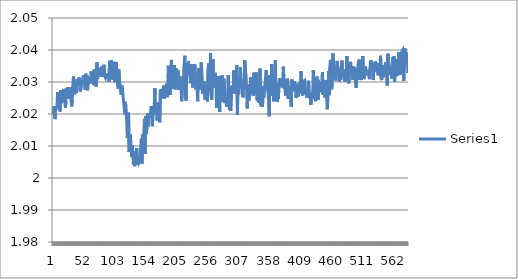
| Category | Series 0 |
|---|---|
| 0 | 2.02 |
| 1 | 2.022 |
| 2 | 2.019 |
| 3 | 2.018 |
| 4 | 2.022 |
| 5 | 2.022 |
| 6 | 2.022 |
| 7 | 2.027 |
| 8 | 2.022 |
| 9 | 2.026 |
| 10 | 2.023 |
| 11 | 2.021 |
| 12 | 2.027 |
| 13 | 2.023 |
| 14 | 2.026 |
| 15 | 2.025 |
| 16 | 2.027 |
| 17 | 2.028 |
| 18 | 2.025 |
| 19 | 2.023 |
| 20 | 2.022 |
| 21 | 2.028 |
| 22 | 2.025 |
| 23 | 2.025 |
| 24 | 2.028 |
| 25 | 2.026 |
| 26 | 2.025 |
| 27 | 2.026 |
| 28 | 2.028 |
| 29 | 2.028 |
| 30 | 2.022 |
| 31 | 2.024 |
| 32 | 2.029 |
| 33 | 2.032 |
| 34 | 2.031 |
| 35 | 2.026 |
| 36 | 2.029 |
| 37 | 2.029 |
| 38 | 2.027 |
| 39 | 2.031 |
| 40 | 2.029 |
| 41 | 2.03 |
| 42 | 2.031 |
| 43 | 2.03 |
| 44 | 2.027 |
| 45 | 2.027 |
| 46 | 2.029 |
| 47 | 2.03 |
| 48 | 2.031 |
| 49 | 2.032 |
| 50 | 2.032 |
| 51 | 2.031 |
| 52 | 2.028 |
| 53 | 2.033 |
| 54 | 2.03 |
| 55 | 2.032 |
| 56 | 2.027 |
| 57 | 2.03 |
| 58 | 2.029 |
| 59 | 2.031 |
| 60 | 2.03 |
| 61 | 2.03 |
| 62 | 2.033 |
| 63 | 2.03 |
| 64 | 2.033 |
| 65 | 2.033 |
| 66 | 2.029 |
| 67 | 2.034 |
| 68 | 2.029 |
| 69 | 2.033 |
| 70 | 2.029 |
| 71 | 2.036 |
| 72 | 2.035 |
| 73 | 2.033 |
| 74 | 2.032 |
| 75 | 2.032 |
| 76 | 2.033 |
| 77 | 2.034 |
| 78 | 2.032 |
| 79 | 2.032 |
| 80 | 2.035 |
| 81 | 2.032 |
| 82 | 2.033 |
| 83 | 2.035 |
| 84 | 2.032 |
| 85 | 2.031 |
| 86 | 2.033 |
| 87 | 2.033 |
| 88 | 2.031 |
| 89 | 2.033 |
| 90 | 2.031 |
| 91 | 2.03 |
| 92 | 2.037 |
| 93 | 2.035 |
| 94 | 2.035 |
| 95 | 2.037 |
| 96 | 2.031 |
| 97 | 2.031 |
| 98 | 2.032 |
| 99 | 2.034 |
| 100 | 2.036 |
| 101 | 2.03 |
| 102 | 2.034 |
| 103 | 2.036 |
| 104 | 2.033 |
| 105 | 2.03 |
| 106 | 2.028 |
| 107 | 2.034 |
| 108 | 2.031 |
| 109 | 2.031 |
| 110 | 2.027 |
| 111 | 2.026 |
| 112 | 2.029 |
| 113 | 2.028 |
| 114 | 2.026 |
| 115 | 2.024 |
| 116 | 2.023 |
| 117 | 2.02 |
| 118 | 2.024 |
| 119 | 2.02 |
| 120 | 2.018 |
| 121 | 2.013 |
| 122 | 2.012 |
| 123 | 2.02 |
| 124 | 2.008 |
| 125 | 2.01 |
| 126 | 2.014 |
| 127 | 2.01 |
| 128 | 2.007 |
| 129 | 2.01 |
| 130 | 2.007 |
| 131 | 2.004 |
| 132 | 2.008 |
| 133 | 2.004 |
| 134 | 2.006 |
| 135 | 2.006 |
| 136 | 2.009 |
| 137 | 2.004 |
| 138 | 2.007 |
| 139 | 2.006 |
| 140 | 2.005 |
| 141 | 2.005 |
| 142 | 2.009 |
| 143 | 2.008 |
| 144 | 2.012 |
| 145 | 2.005 |
| 146 | 2.014 |
| 147 | 2.012 |
| 148 | 2.014 |
| 149 | 2.018 |
| 150 | 2.007 |
| 151 | 2.019 |
| 152 | 2.014 |
| 153 | 2.016 |
| 154 | 2.02 |
| 155 | 2.016 |
| 156 | 2.017 |
| 157 | 2.02 |
| 158 | 2.019 |
| 159 | 2.02 |
| 160 | 2.022 |
| 161 | 2.022 |
| 162 | 2.016 |
| 163 | 2.02 |
| 164 | 2.021 |
| 165 | 2.022 |
| 166 | 2.028 |
| 167 | 2.02 |
| 168 | 2.023 |
| 169 | 2.023 |
| 170 | 2.018 |
| 171 | 2.024 |
| 172 | 2.023 |
| 173 | 2.022 |
| 174 | 2.017 |
| 175 | 2.027 |
| 176 | 2.028 |
| 177 | 2.026 |
| 178 | 2.028 |
| 179 | 2.025 |
| 180 | 2.028 |
| 181 | 2.029 |
| 182 | 2.025 |
| 183 | 2.027 |
| 184 | 2.027 |
| 185 | 2.03 |
| 186 | 2.025 |
| 187 | 2.026 |
| 188 | 2.035 |
| 189 | 2.031 |
| 190 | 2.028 |
| 191 | 2.026 |
| 192 | 2.032 |
| 193 | 2.037 |
| 194 | 2.033 |
| 195 | 2.028 |
| 196 | 2.031 |
| 197 | 2.033 |
| 198 | 2.035 |
| 199 | 2.028 |
| 200 | 2.028 |
| 201 | 2.034 |
| 202 | 2.03 |
| 203 | 2.03 |
| 204 | 2.034 |
| 205 | 2.027 |
| 206 | 2.03 |
| 207 | 2.032 |
| 208 | 2.029 |
| 209 | 2.027 |
| 210 | 2.024 |
| 211 | 2.03 |
| 212 | 2.032 |
| 213 | 2.028 |
| 214 | 2.036 |
| 215 | 2.038 |
| 216 | 2.025 |
| 217 | 2.024 |
| 218 | 2.031 |
| 219 | 2.036 |
| 220 | 2.033 |
| 221 | 2.037 |
| 222 | 2.032 |
| 223 | 2.033 |
| 224 | 2.031 |
| 225 | 2.03 |
| 226 | 2.036 |
| 227 | 2.033 |
| 228 | 2.028 |
| 229 | 2.033 |
| 230 | 2.032 |
| 231 | 2.036 |
| 232 | 2.034 |
| 233 | 2.028 |
| 234 | 2.032 |
| 235 | 2.029 |
| 236 | 2.024 |
| 237 | 2.033 |
| 238 | 2.034 |
| 239 | 2.03 |
| 240 | 2.032 |
| 241 | 2.028 |
| 242 | 2.036 |
| 243 | 2.036 |
| 244 | 2.026 |
| 245 | 2.029 |
| 246 | 2.03 |
| 247 | 2.029 |
| 248 | 2.025 |
| 249 | 2.028 |
| 250 | 2.027 |
| 251 | 2.026 |
| 252 | 2.024 |
| 253 | 2.034 |
| 254 | 2.036 |
| 255 | 2.027 |
| 256 | 2.031 |
| 257 | 2.039 |
| 258 | 2.026 |
| 259 | 2.024 |
| 260 | 2.031 |
| 261 | 2.037 |
| 262 | 2.03 |
| 263 | 2.028 |
| 264 | 2.033 |
| 265 | 2.033 |
| 266 | 2.03 |
| 267 | 2.022 |
| 268 | 2.032 |
| 269 | 2.025 |
| 270 | 2.024 |
| 271 | 2.025 |
| 272 | 2.021 |
| 273 | 2.031 |
| 274 | 2.032 |
| 275 | 2.029 |
| 276 | 2.032 |
| 277 | 2.024 |
| 278 | 2.027 |
| 279 | 2.031 |
| 280 | 2.031 |
| 281 | 2.023 |
| 282 | 2.025 |
| 283 | 2.025 |
| 284 | 2.022 |
| 285 | 2.025 |
| 286 | 2.032 |
| 287 | 2.026 |
| 288 | 2.021 |
| 289 | 2.028 |
| 290 | 2.021 |
| 291 | 2.026 |
| 292 | 2.029 |
| 293 | 2.028 |
| 294 | 2.026 |
| 295 | 2.034 |
| 296 | 2.03 |
| 297 | 2.028 |
| 298 | 2.026 |
| 299 | 2.029 |
| 300 | 2.035 |
| 301 | 2.02 |
| 302 | 2.032 |
| 303 | 2.026 |
| 304 | 2.031 |
| 305 | 2.029 |
| 306 | 2.035 |
| 307 | 2.028 |
| 308 | 2.031 |
| 309 | 2.027 |
| 310 | 2.025 |
| 311 | 2.027 |
| 312 | 2.028 |
| 313 | 2.037 |
| 314 | 2.033 |
| 315 | 2.032 |
| 316 | 2.028 |
| 317 | 2.022 |
| 318 | 2.029 |
| 319 | 2.026 |
| 320 | 2.024 |
| 321 | 2.029 |
| 322 | 2.026 |
| 323 | 2.031 |
| 324 | 2.027 |
| 325 | 2.027 |
| 326 | 2.028 |
| 327 | 2.026 |
| 328 | 2.033 |
| 329 | 2.031 |
| 330 | 2.026 |
| 331 | 2.03 |
| 332 | 2.033 |
| 333 | 2.025 |
| 334 | 2.025 |
| 335 | 2.024 |
| 336 | 2.024 |
| 337 | 2.024 |
| 338 | 2.034 |
| 339 | 2.023 |
| 340 | 2.022 |
| 341 | 2.027 |
| 342 | 2.022 |
| 343 | 2.029 |
| 344 | 2.025 |
| 345 | 2.028 |
| 346 | 2.029 |
| 347 | 2.031 |
| 348 | 2.034 |
| 349 | 2.028 |
| 350 | 2.027 |
| 351 | 2.027 |
| 352 | 2.027 |
| 353 | 2.019 |
| 354 | 2.032 |
| 355 | 2.03 |
| 356 | 2.026 |
| 357 | 2.036 |
| 358 | 2.026 |
| 359 | 2.032 |
| 360 | 2.024 |
| 361 | 2.029 |
| 362 | 2.029 |
| 363 | 2.037 |
| 364 | 2.024 |
| 365 | 2.029 |
| 366 | 2.024 |
| 367 | 2.03 |
| 368 | 2.025 |
| 369 | 2.03 |
| 370 | 2.031 |
| 371 | 2.029 |
| 372 | 2.03 |
| 373 | 2.029 |
| 374 | 2.029 |
| 375 | 2.029 |
| 376 | 2.035 |
| 377 | 2.031 |
| 378 | 2.029 |
| 379 | 2.027 |
| 380 | 2.026 |
| 381 | 2.031 |
| 382 | 2.027 |
| 383 | 2.031 |
| 384 | 2.025 |
| 385 | 2.029 |
| 386 | 2.028 |
| 387 | 2.026 |
| 388 | 2.028 |
| 389 | 2.022 |
| 390 | 2.031 |
| 391 | 2.028 |
| 392 | 2.027 |
| 393 | 2.028 |
| 394 | 2.03 |
| 395 | 2.027 |
| 396 | 2.03 |
| 397 | 2.025 |
| 398 | 2.025 |
| 399 | 2.029 |
| 400 | 2.026 |
| 401 | 2.027 |
| 402 | 2.03 |
| 403 | 2.026 |
| 404 | 2.028 |
| 405 | 2.033 |
| 406 | 2.028 |
| 407 | 2.027 |
| 408 | 2.026 |
| 409 | 2.03 |
| 410 | 2.03 |
| 411 | 2.03 |
| 412 | 2.028 |
| 413 | 2.026 |
| 414 | 2.028 |
| 415 | 2.025 |
| 416 | 2.026 |
| 417 | 2.03 |
| 418 | 2.028 |
| 419 | 2.025 |
| 420 | 2.027 |
| 421 | 2.023 |
| 422 | 2.026 |
| 423 | 2.025 |
| 424 | 2.025 |
| 425 | 2.034 |
| 426 | 2.029 |
| 427 | 2.03 |
| 428 | 2.025 |
| 429 | 2.024 |
| 430 | 2.028 |
| 431 | 2.032 |
| 432 | 2.028 |
| 433 | 2.025 |
| 434 | 2.029 |
| 435 | 2.027 |
| 436 | 2.029 |
| 437 | 2.029 |
| 438 | 2.03 |
| 439 | 2.027 |
| 440 | 2.033 |
| 441 | 2.026 |
| 442 | 2.03 |
| 443 | 2.03 |
| 444 | 2.025 |
| 445 | 2.03 |
| 446 | 2.027 |
| 447 | 2.028 |
| 448 | 2.022 |
| 449 | 2.026 |
| 450 | 2.033 |
| 451 | 2.026 |
| 452 | 2.034 |
| 453 | 2.037 |
| 454 | 2.036 |
| 455 | 2.028 |
| 456 | 2.029 |
| 457 | 2.039 |
| 458 | 2.037 |
| 459 | 2.033 |
| 460 | 2.032 |
| 461 | 2.03 |
| 462 | 2.032 |
| 463 | 2.034 |
| 464 | 2.037 |
| 465 | 2.035 |
| 466 | 2.034 |
| 467 | 2.03 |
| 468 | 2.03 |
| 469 | 2.031 |
| 470 | 2.031 |
| 471 | 2.034 |
| 472 | 2.037 |
| 473 | 2.032 |
| 474 | 2.032 |
| 475 | 2.034 |
| 476 | 2.03 |
| 477 | 2.03 |
| 478 | 2.034 |
| 479 | 2.032 |
| 480 | 2.038 |
| 481 | 2.031 |
| 482 | 2.035 |
| 483 | 2.03 |
| 484 | 2.034 |
| 485 | 2.035 |
| 486 | 2.036 |
| 487 | 2.033 |
| 488 | 2.034 |
| 489 | 2.031 |
| 490 | 2.035 |
| 491 | 2.033 |
| 492 | 2.035 |
| 493 | 2.031 |
| 494 | 2.031 |
| 495 | 2.028 |
| 496 | 2.032 |
| 497 | 2.033 |
| 498 | 2.035 |
| 499 | 2.036 |
| 500 | 2.037 |
| 501 | 2.031 |
| 502 | 2.035 |
| 503 | 2.034 |
| 504 | 2.031 |
| 505 | 2.036 |
| 506 | 2.038 |
| 507 | 2.033 |
| 508 | 2.031 |
| 509 | 2.033 |
| 510 | 2.035 |
| 511 | 2.034 |
| 512 | 2.032 |
| 513 | 2.034 |
| 514 | 2.032 |
| 515 | 2.033 |
| 516 | 2.034 |
| 517 | 2.031 |
| 518 | 2.035 |
| 519 | 2.037 |
| 520 | 2.035 |
| 521 | 2.034 |
| 522 | 2.036 |
| 523 | 2.031 |
| 524 | 2.034 |
| 525 | 2.033 |
| 526 | 2.035 |
| 527 | 2.036 |
| 528 | 2.033 |
| 529 | 2.034 |
| 530 | 2.036 |
| 531 | 2.032 |
| 532 | 2.032 |
| 533 | 2.034 |
| 534 | 2.035 |
| 535 | 2.038 |
| 536 | 2.031 |
| 537 | 2.031 |
| 538 | 2.035 |
| 539 | 2.034 |
| 540 | 2.031 |
| 541 | 2.034 |
| 542 | 2.032 |
| 543 | 2.036 |
| 544 | 2.034 |
| 545 | 2.034 |
| 546 | 2.029 |
| 547 | 2.039 |
| 548 | 2.035 |
| 549 | 2.034 |
| 550 | 2.033 |
| 551 | 2.032 |
| 552 | 2.035 |
| 553 | 2.031 |
| 554 | 2.036 |
| 555 | 2.038 |
| 556 | 2.033 |
| 557 | 2.038 |
| 558 | 2.03 |
| 559 | 2.037 |
| 560 | 2.034 |
| 561 | 2.032 |
| 562 | 2.037 |
| 563 | 2.034 |
| 564 | 2.032 |
| 565 | 2.039 |
| 566 | 2.037 |
| 567 | 2.034 |
| 568 | 2.032 |
| 569 | 2.039 |
| 570 | 2.039 |
| 571 | 2.04 |
| 572 | 2.035 |
| 573 | 2.03 |
| 574 | 2.036 |
| 575 | 2.041 |
| 576 | 2.038 |
| 577 | 2.035 |
| 578 | 2.039 |
| 579 | 2.038 |
| 580 | 2.033 |
| 581 | 2.039 |